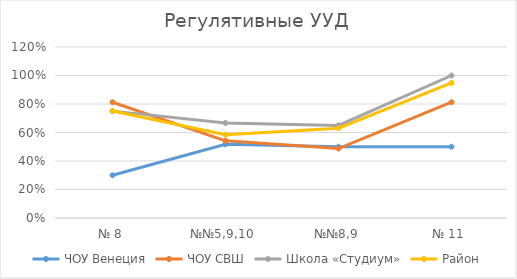
| Category | ЧОУ Венеция | ЧОУ СВШ | Школа «Студиум» | Район |
|---|---|---|---|---|
| № 8 | 0.3 | 0.812 | 0.75 | 0.751 |
| №№5,9,10 | 0.517 | 0.542 | 0.667 | 0.584 |
| №№8,9 | 0.5 | 0.488 | 0.65 | 0.63 |
| № 11 | 0.5 | 0.812 | 1 | 0.948 |